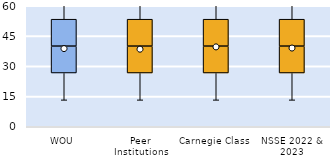
| Category | 25th | 50th | 75th |
|---|---|---|---|
| WOU | 26.667 | 13.333 | 13.333 |
| Peer Institutions | 26.667 | 13.333 | 13.333 |
| Carnegie Class | 26.667 | 13.333 | 13.333 |
| NSSE 2022 & 2023 | 26.667 | 13.333 | 13.333 |